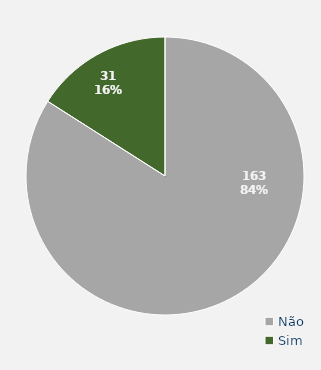
| Category | Total |
|---|---|
| Não | 163 |
| Sim | 31 |